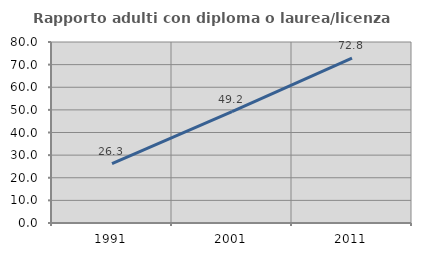
| Category | Rapporto adulti con diploma o laurea/licenza media  |
|---|---|
| 1991.0 | 26.289 |
| 2001.0 | 49.194 |
| 2011.0 | 72.84 |